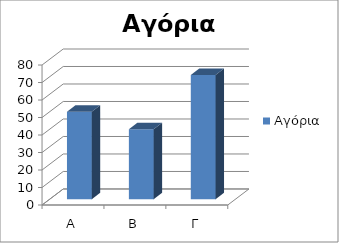
| Category | Αγόρια |
|---|---|
| Α | 50 |
| Β | 40 |
| Γ | 71 |